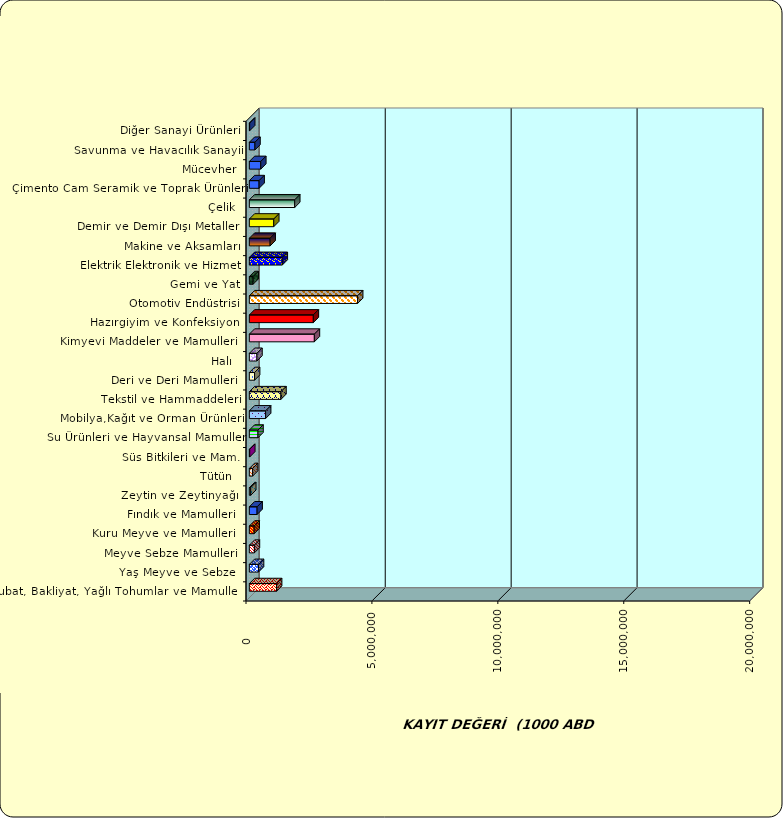
| Category | Series 0 |
|---|---|
|  Hububat, Bakliyat, Yağlı Tohumlar ve Mamulleri  | 1081591.473 |
|  Yaş Meyve ve Sebze   | 363335.816 |
|  Meyve Sebze Mamulleri  | 200440.35 |
|  Kuru Meyve ve Mamulleri   | 190978.334 |
|  Fındık ve Mamulleri  | 307918.5 |
|  Zeytin ve Zeytinyağı  | 54050.561 |
|  Tütün  | 129253.308 |
|  Süs Bitkileri ve Mam. | 15862.6 |
|  Su Ürünleri ve Hayvansal Mamuller | 342867.294 |
|  Mobilya,Kağıt ve Orman Ürünleri | 645760.579 |
|  Tekstil ve Hammaddeleri | 1254562.791 |
|  Deri ve Deri Mamulleri  | 207772.472 |
|  Halı  | 301733.671 |
|  Kimyevi Maddeler ve Mamulleri   | 2581961.65 |
|  Hazırgiyim ve Konfeksiyon  | 2540816.836 |
|  Otomotiv Endüstrisi | 4299424.583 |
|  Gemi ve Yat | 149826.131 |
|  Elektrik Elektronik ve Hizmet | 1307323.267 |
|  Makine ve Aksamları | 825859.9 |
|  Demir ve Demir Dışı Metaller  | 969113.575 |
|  Çelik | 1801411.41 |
|  Çimento Cam Seramik ve Toprak Ürünleri | 386645.273 |
|  Mücevher | 454191.224 |
|  Savunma ve Havacılık Sanayii | 222596.171 |
|  Diğer Sanayi Ürünleri | 13260.573 |